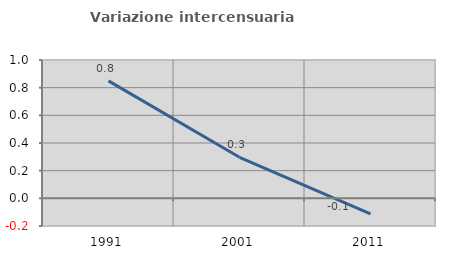
| Category | Variazione intercensuaria annua |
|---|---|
| 1991.0 | 0.849 |
| 2001.0 | 0.297 |
| 2011.0 | -0.112 |